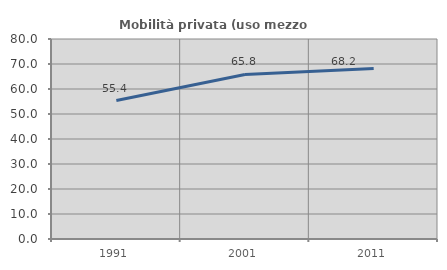
| Category | Mobilità privata (uso mezzo privato) |
|---|---|
| 1991.0 | 55.364 |
| 2001.0 | 65.831 |
| 2011.0 | 68.216 |